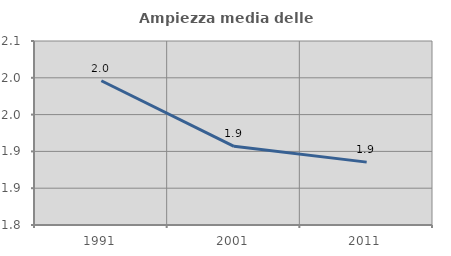
| Category | Ampiezza media delle famiglie |
|---|---|
| 1991.0 | 1.996 |
| 2001.0 | 1.907 |
| 2011.0 | 1.885 |